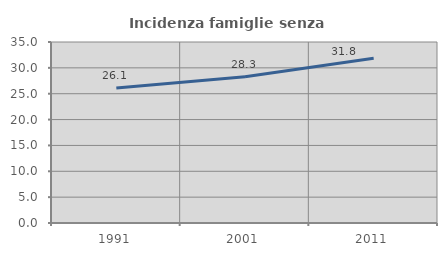
| Category | Incidenza famiglie senza nuclei |
|---|---|
| 1991.0 | 26.124 |
| 2001.0 | 28.268 |
| 2011.0 | 31.84 |